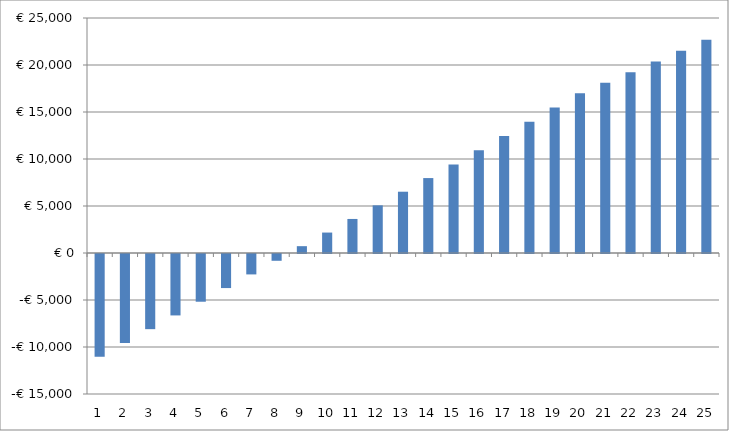
| Category | Series 0 |
|---|---|
| 0 | -10928.9 |
| 1 | -9459.797 |
| 2 | -7995.204 |
| 3 | -6534.624 |
| 4 | -5077.541 |
| 5 | -3623.43 |
| 6 | -2171.747 |
| 7 | -721.934 |
| 8 | 726.584 |
| 9 | 2174.399 |
| 10 | 3622.121 |
| 11 | 5070.378 |
| 12 | 6519.818 |
| 13 | 7971.11 |
| 14 | 9424.943 |
| 15 | 10932.028 |
| 16 | 12443.1 |
| 17 | 13958.916 |
| 18 | 15480.262 |
| 19 | 17007.945 |
| 20 | 18118.313 |
| 21 | 19239.64 |
| 22 | 20372.794 |
| 23 | 21518.673 |
| 24 | 22678.207 |